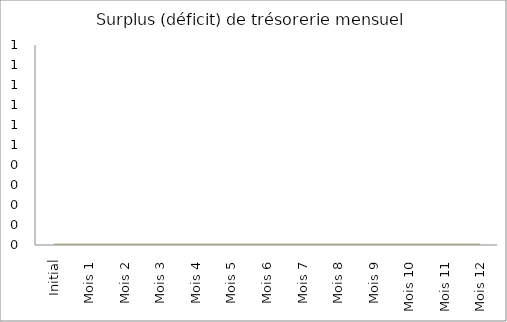
| Category | Surplus (déficit) de trésorerie mensuel |
|---|---|
| Initial | 0 |
| Mois 1 | 0 |
| Mois 2 | 0 |
| Mois 3 | 0 |
| Mois 4 | 0 |
| Mois 5 | 0 |
| Mois 6 | 0 |
| Mois 7 | 0 |
| Mois 8 | 0 |
| Mois 9 | 0 |
| Mois 10 | 0 |
| Mois 11 | 0 |
| Mois 12 | 0 |